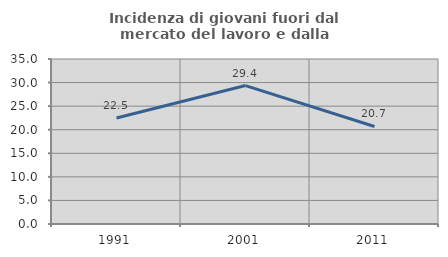
| Category | Incidenza di giovani fuori dal mercato del lavoro e dalla formazione  |
|---|---|
| 1991.0 | 22.472 |
| 2001.0 | 29.365 |
| 2011.0 | 20.69 |